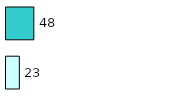
| Category | Series 0 | Series 1 |
|---|---|---|
| 0 | 23 | 48 |